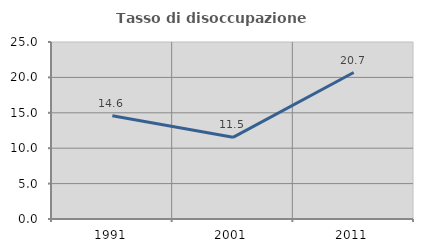
| Category | Tasso di disoccupazione giovanile  |
|---|---|
| 1991.0 | 14.583 |
| 2001.0 | 11.538 |
| 2011.0 | 20.69 |